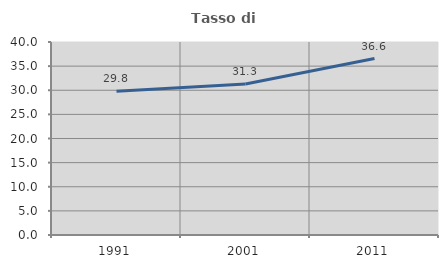
| Category | Tasso di occupazione   |
|---|---|
| 1991.0 | 29.784 |
| 2001.0 | 31.278 |
| 2011.0 | 36.561 |